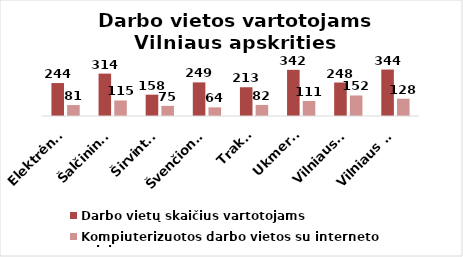
| Category | Darbo vietų skaičius vartotojams | Kompiuterizuotos darbo vietos su interneto prieiga |
|---|---|---|
| Elektrėnai | 244 | 81 |
| Šalčininkai | 314 | 115 |
| Širvintos | 158 | 75 |
| Švenčionys | 249 | 64 |
| Trakai | 213 | 82 |
| Ukmergė | 342 | 111 |
| Vilniaus r. | 248 | 152 |
| Vilniaus m. | 344 | 128 |